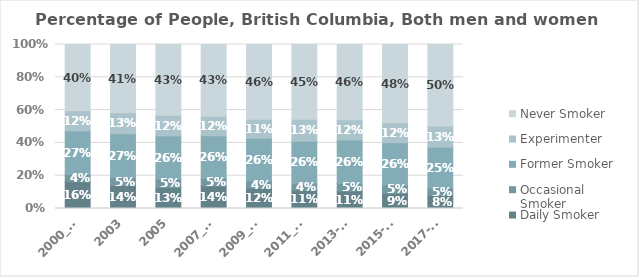
| Category | Daily Smoker | Occasional Smoker | Former Smoker | Experimenter | Never Smoker |
|---|---|---|---|---|---|
| 2000_01 | 0.162 | 0.043 | 0.265 | 0.121 | 0.402 |
| 2003 | 0.14 | 0.047 | 0.266 | 0.128 | 0.414 |
| 2005 | 0.126 | 0.051 | 0.263 | 0.125 | 0.43 |
| 2007_08 | 0.136 | 0.046 | 0.259 | 0.118 | 0.435 |
| 2009_10 | 0.123 | 0.044 | 0.26 | 0.115 | 0.455 |
| 2011_12 | 0.11 | 0.04 | 0.259 | 0.133 | 0.453 |
| 2013-14 | 0.105 | 0.047 | 0.264 | 0.122 | 0.457 |
| 2015-16 | 0.091 | 0.05 | 0.26 | 0.121 | 0.478 |
| 2017-18 | 0.079 | 0.047 | 0.248 | 0.129 | 0.497 |